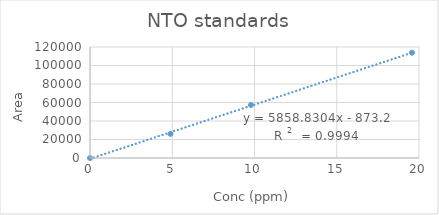
| Category | Series 0 |
|---|---|
| 0.0 | 0 |
| 4.893 | 26074 |
| 9.786 | 57295 |
| 19.572 | 113809 |